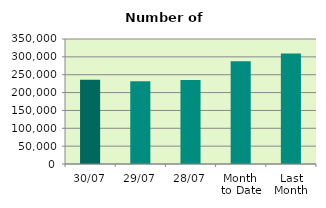
| Category | Series 0 |
|---|---|
| 30/07 | 235914 |
| 29/07 | 231376 |
| 28/07 | 235250 |
| Month 
to Date | 287917.636 |
| Last
Month | 309731.364 |